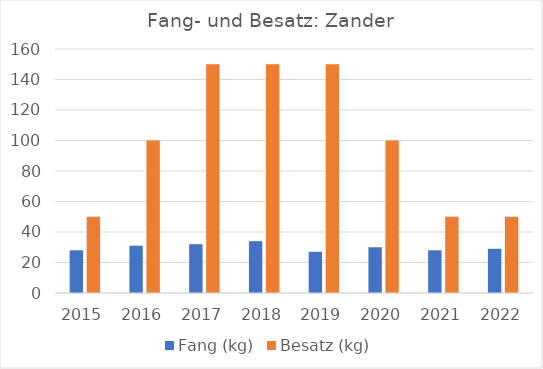
| Category | Fang (kg) | Besatz (kg) |
|---|---|---|
| 2015.0 | 28 | 50 |
| 2016.0 | 31 | 100 |
| 2017.0 | 32 | 150 |
| 2018.0 | 34 | 150 |
| 2019.0 | 27 | 150 |
| 2020.0 | 30 | 100 |
| 2021.0 | 28 | 50 |
| 2022.0 | 29 | 50 |